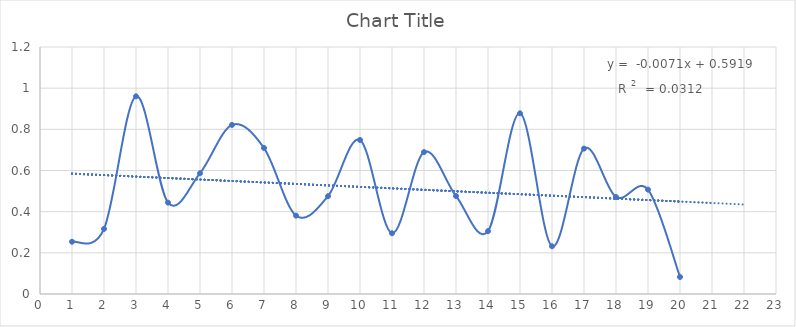
| Category | Series 0 |
|---|---|
| 1.0 | 0.254 |
| 2.0 | 0.316 |
| 3.0 | 0.96 |
| 4.0 | 0.444 |
| 5.0 | 0.587 |
| 6.0 | 0.822 |
| 7.0 | 0.709 |
| 8.0 | 0.381 |
| 9.0 | 0.475 |
| 10.0 | 0.748 |
| 11.0 | 0.295 |
| 12.0 | 0.689 |
| 13.0 | 0.476 |
| 14.0 | 0.305 |
| 15.0 | 0.878 |
| 16.0 | 0.232 |
| 17.0 | 0.707 |
| 18.0 | 0.471 |
| 19.0 | 0.507 |
| 20.0 | 0.083 |